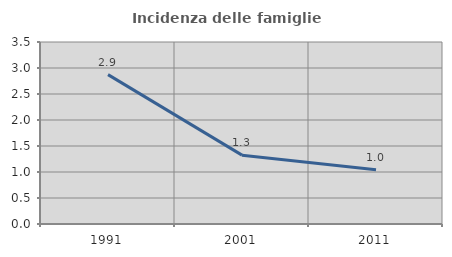
| Category | Incidenza delle famiglie numerose |
|---|---|
| 1991.0 | 2.872 |
| 2001.0 | 1.324 |
| 2011.0 | 1.043 |